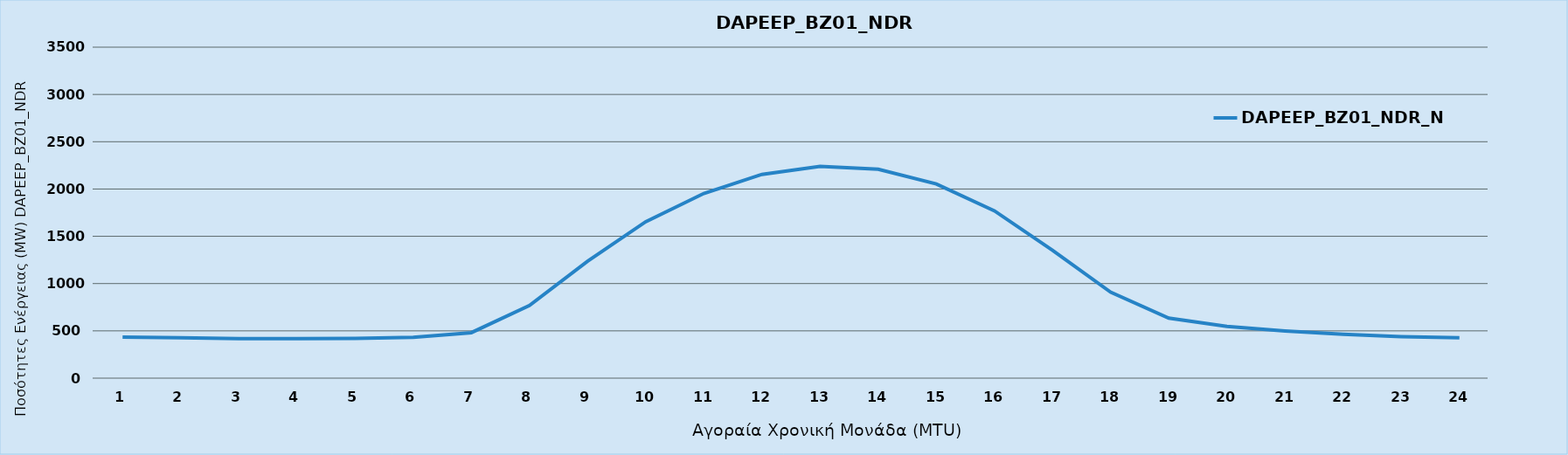
| Category | DAPEEP_BZ01_NDR_N1 |
|---|---|
| 0 | 435 |
| 1 | 426 |
| 2 | 417 |
| 3 | 417 |
| 4 | 421 |
| 5 | 431 |
| 6 | 481 |
| 7 | 768 |
| 8 | 1236 |
| 9 | 1654 |
| 10 | 1953 |
| 11 | 2155 |
| 12 | 2240 |
| 13 | 2209 |
| 14 | 2054 |
| 15 | 1769 |
| 16 | 1352 |
| 17 | 909 |
| 18 | 635 |
| 19 | 547 |
| 20 | 499 |
| 21 | 463 |
| 22 | 439 |
| 23 | 426 |